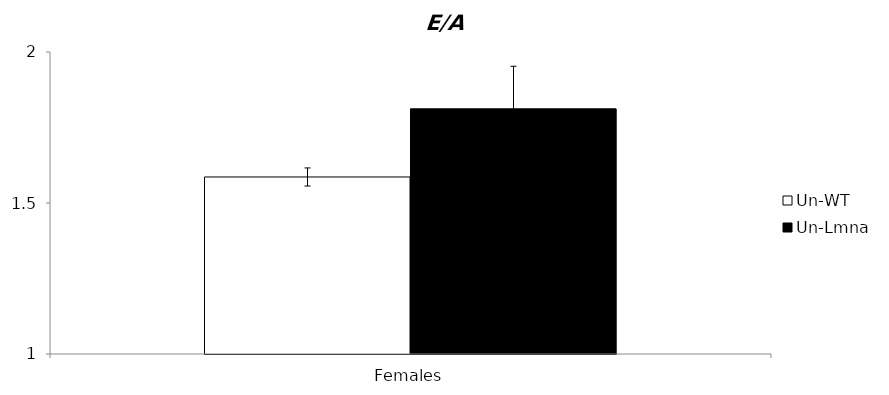
| Category | Un-WT | Un-Lmna |
|---|---|---|
| 0 | 1.586 | 1.812 |